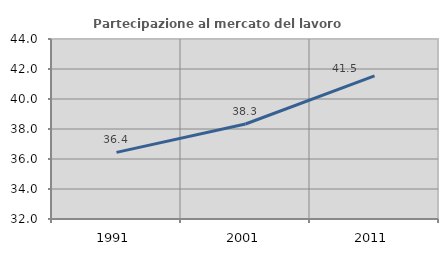
| Category | Partecipazione al mercato del lavoro  femminile |
|---|---|
| 1991.0 | 36.44 |
| 2001.0 | 38.333 |
| 2011.0 | 41.546 |